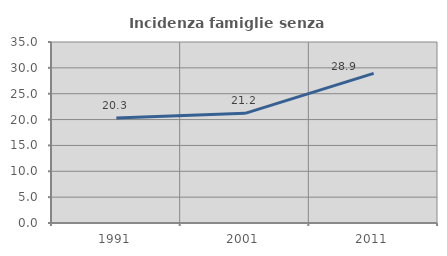
| Category | Incidenza famiglie senza nuclei |
|---|---|
| 1991.0 | 20.292 |
| 2001.0 | 21.199 |
| 2011.0 | 28.92 |